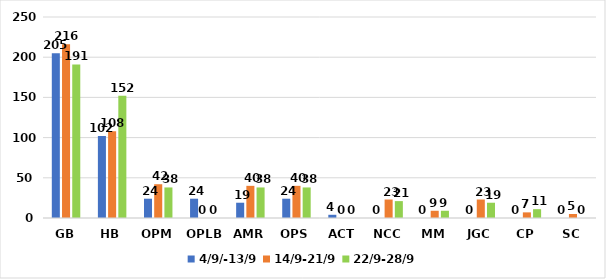
| Category | 4/9/-13/9 | 14/9-21/9 | 22/9-28/9 |
|---|---|---|---|
| GB | 205 | 216 | 191 |
| HB | 102 | 108 | 152 |
| OPM | 24 | 42 | 38 |
| OPLB | 24 | 0 | 0 |
| AMR | 19 | 40 | 38 |
| OPS | 24 | 40 | 38 |
| ACT | 4 | 0 | 0 |
| NCC | 0 | 23 | 21 |
| MM | 0 | 9 | 9 |
| JGC | 0 | 23 | 19 |
| CP | 0 | 7 | 11 |
| SC | 0 | 5 | 0 |